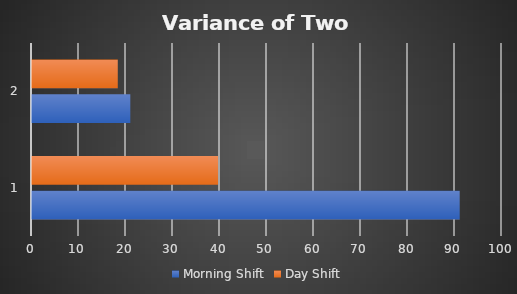
| Category | Morning Shift | Day Shift |
|---|---|---|
| 0 | 91 | 39.583 |
| 1 | 20.917 | 18.25 |